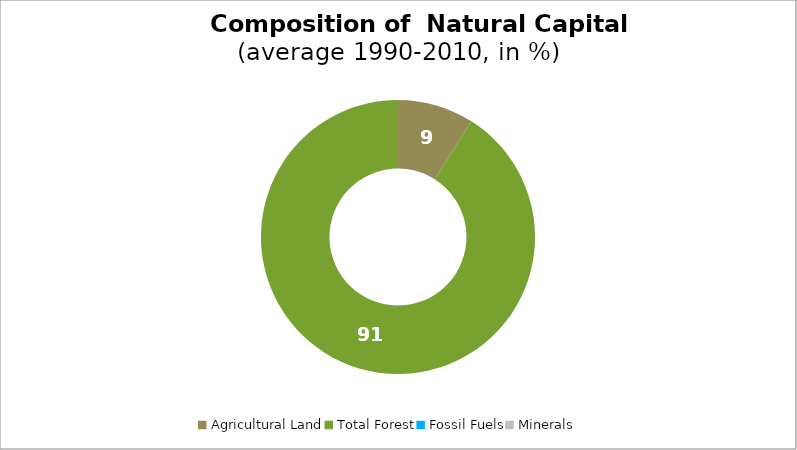
| Category | Series 0 |
|---|---|
| Agricultural Land | 9.006 |
| Total Forest | 90.994 |
| Fossil Fuels | 0 |
| Minerals | 0 |